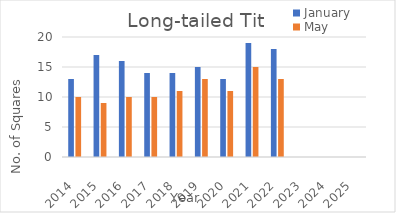
| Category | January | May |
|---|---|---|
| 2014.0 | 13 | 10 |
| 2015.0 | 17 | 9 |
| 2016.0 | 16 | 10 |
| 2017.0 | 14 | 10 |
| 2018.0 | 14 | 11 |
| 2019.0 | 15 | 13 |
| 2020.0 | 13 | 11 |
| 2021.0 | 19 | 15 |
| 2022.0 | 18 | 13 |
| 2023.0 | 0 | 0 |
| 2024.0 | 0 | 0 |
| 2025.0 | 0 | 0 |